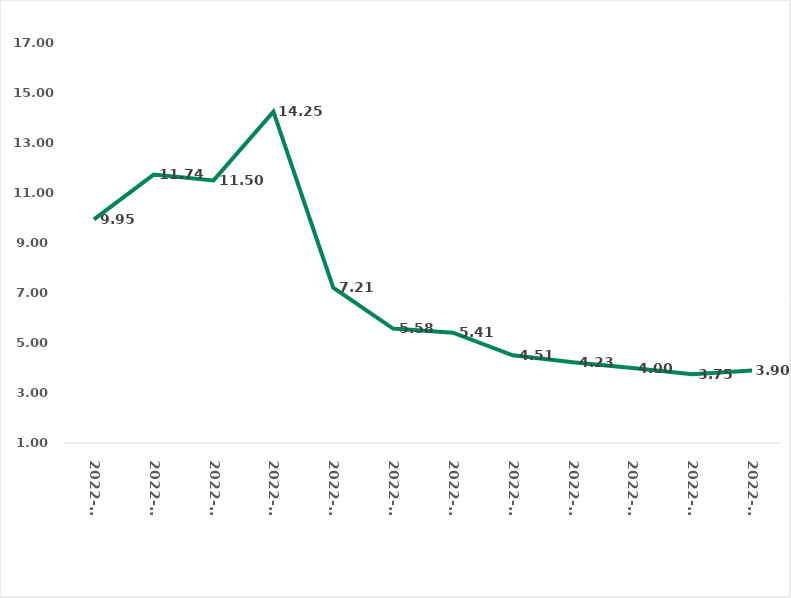
| Category | Waiting Time, Days |
|---|---|
| 2022-01 | 9.947 |
| 2022-02 | 11.737 |
| 2022-03 | 11.504 |
| 2022-04 | 14.252 |
| 2022-05 | 7.211 |
| 2022-06 | 5.576 |
| 2022-07 | 5.412 |
| 2022-08 | 4.507 |
| 2022-09 | 4.231 |
| 2022-10 | 4 |
| 2022-11 | 3.748 |
| 2022-12 | 3.901 |